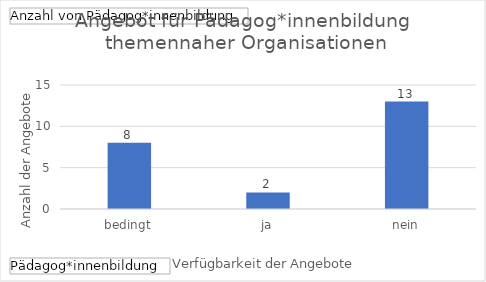
| Category | Ergebnis |
|---|---|
| bedingt | 8 |
| ja | 2 |
| nein | 13 |